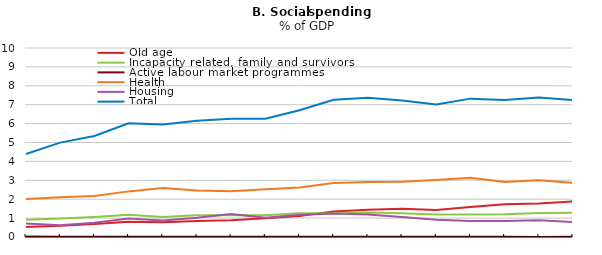
| Category | Old age | Incapacity related, family and survivors | Active labour market programmes | Health | Housing | Total |
|---|---|---|---|---|---|---|
|  | 0.53 | 0.912 | 0.021 | 2.012 | 0.717 | 4.391 |
|  | 0.591 | 0.973 | 0.018 | 2.109 | 0.618 | 4.992 |
|  | 0.687 | 1.056 | 0.014 | 2.165 | 0.759 | 5.346 |
|  | 0.801 | 1.178 | 0.013 | 2.414 | 0.979 | 6.02 |
|  | 0.78 | 1.056 | 0.01 | 2.587 | 0.877 | 5.954 |
|  | 0.852 | 1.145 | 0.012 | 2.465 | 1.019 | 6.145 |
|  | 0.884 | 1.147 | 0.009 | 2.422 | 1.211 | 6.26 |
|  | 0.998 | 1.152 | 0.007 | 2.527 | 1.018 | 6.255 |
|  | 1.116 | 1.262 | 0.011 | 2.617 | 1.18 | 6.704 |
|  | 1.35 | 1.239 | 0.012 | 2.861 | 1.245 | 7.262 |
|  | 1.443 | 1.292 | 0.011 | 2.907 | 1.191 | 7.368 |
|  | 1.501 | 1.253 | 0.008 | 2.926 | 1.054 | 7.222 |
|  | 1.429 | 1.197 | 0.01 | 3.014 | 0.915 | 7.007 |
|  | 1.592 | 1.195 | 0.01 | 3.135 | 0.844 | 7.321 |
|  | 1.734 | 1.198 | 0.009 | 2.905 | 0.852 | 7.246 |
|  | 1.767 | 1.264 | 0.005 | 3.003 | 0.881 | 7.384 |
|  | 1.887 | 1.278 | 0.007 | 2.862 | 0.796 | 7.242 |